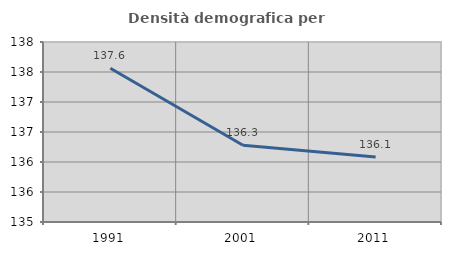
| Category | Densità demografica |
|---|---|
| 1991.0 | 137.562 |
| 2001.0 | 136.28 |
| 2011.0 | 136.083 |